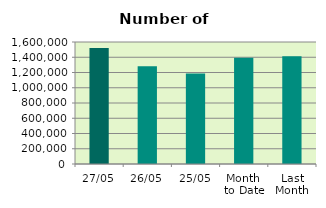
| Category | Series 0 |
|---|---|
| 27/05 | 1522228 |
| 26/05 | 1283190 |
| 25/05 | 1185596 |
| Month 
to Date | 1394448.947 |
| Last
Month | 1414476.2 |